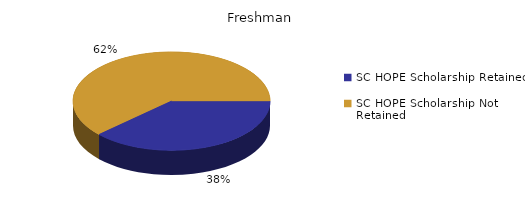
| Category | Freshman |
|---|---|
| SC HOPE Scholarship Retained  | 69 |
| SC HOPE Scholarship Not Retained  | 112 |